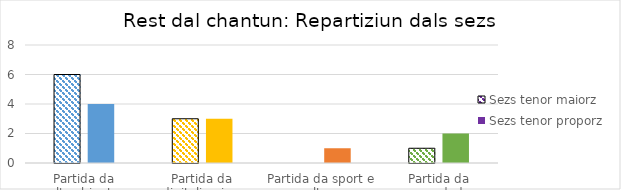
| Category | Sezs tenor maiorz | Sezs tenor proporz |
|---|---|---|
| Partida da l'ambient | 6 | 4 |
| Partida da digitalisaziun | 3 | 3 |
| Partida da sport e cultura  | 0 | 1 |
| Partida da sanadad  | 1 | 2 |